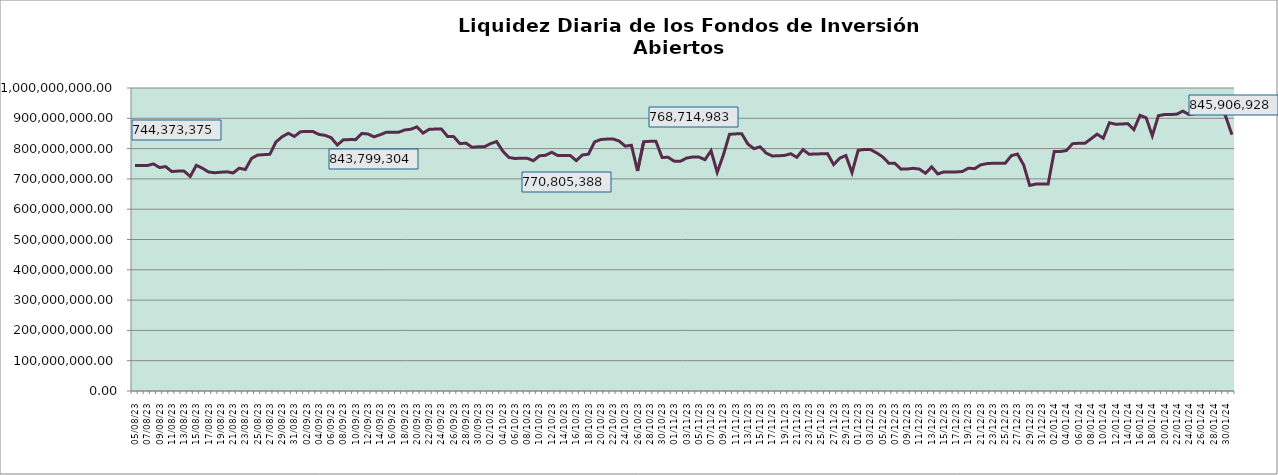
| Category | Series 0 |
|---|---|
| 2023-08-05 | 744373375.25 |
| 2023-08-06 | 744244089.34 |
| 2023-08-07 | 744156721.15 |
| 2023-08-08 | 749436294.31 |
| 2023-08-09 | 737541120.52 |
| 2023-08-10 | 740581950.01 |
| 2023-08-11 | 724080601.72 |
| 2023-08-12 | 725788397.34 |
| 2023-08-13 | 725649372.75 |
| 2023-08-14 | 708067960.8 |
| 2023-08-15 | 744803219.59 |
| 2023-08-16 | 735083408.49 |
| 2023-08-17 | 722859996.71 |
| 2023-08-18 | 720251296.81 |
| 2023-08-19 | 722066163.03 |
| 2023-08-20 | 723480147.63 |
| 2023-08-21 | 719544022.09 |
| 2023-08-22 | 735338465.03 |
| 2023-08-23 | 730883380.15 |
| 2023-08-24 | 767500076.65 |
| 2023-08-25 | 778542441.96 |
| 2023-08-26 | 779996982.01 |
| 2023-08-27 | 781275232.08 |
| 2023-08-28 | 821975308.4 |
| 2023-08-29 | 839149402.66 |
| 2023-08-30 | 850388672.3 |
| 2023-08-31 | 840083050.96 |
| 2023-09-01 | 855717371.21 |
| 2023-09-02 | 856447592.74 |
| 2023-09-03 | 856518443.03 |
| 2023-09-04 | 846800888.01 |
| 2023-09-05 | 843799303.73 |
| 2023-09-06 | 836064243.98 |
| 2023-09-07 | 811835895.2 |
| 2023-09-08 | 829200588.03 |
| 2023-09-09 | 829710703.66 |
| 2023-09-10 | 829589151.05 |
| 2023-09-11 | 849892786.18 |
| 2023-09-12 | 848258732.7 |
| 2023-09-13 | 838817623.5 |
| 2023-09-14 | 845684000.27 |
| 2023-09-15 | 853912064.49 |
| 2023-09-16 | 854003181.36 |
| 2023-09-17 | 853882893.87 |
| 2023-09-18 | 861587443.4 |
| 2023-09-19 | 863825271.92 |
| 2023-09-20 | 871739708.28 |
| 2023-09-21 | 851274397.87 |
| 2023-09-22 | 863690740.26 |
| 2023-09-23 | 864423462.74 |
| 2023-09-24 | 864495939.38 |
| 2023-09-25 | 840094915.65 |
| 2023-09-26 | 839493871.47 |
| 2023-09-27 | 816397016.16 |
| 2023-09-28 | 818057445.14 |
| 2023-09-29 | 804357452.04 |
| 2023-09-30 | 805987241.89 |
| 2023-10-01 | 805861177.96 |
| 2023-10-02 | 816400848.97 |
| 2023-10-03 | 823292924.62 |
| 2023-10-04 | 791885328.33 |
| 2023-10-05 | 770805388.24 |
| 2023-10-06 | 767335904.7 |
| 2023-10-07 | 768415448.37 |
| 2023-10-08 | 768284658.47 |
| 2023-10-09 | 759931172.94 |
| 2023-10-10 | 776307966.06 |
| 2023-10-11 | 777978215.8 |
| 2023-10-12 | 787829367.49 |
| 2023-10-13 | 776843829.35 |
| 2023-10-14 | 776920366.75 |
| 2023-10-15 | 777520156.16 |
| 2023-10-16 | 760311511.08 |
| 2023-10-17 | 778972902.37 |
| 2023-10-18 | 781669931.69 |
| 2023-10-19 | 822356076.87 |
| 2023-10-20 | 829958566.75 |
| 2023-10-21 | 831436078.01 |
| 2023-10-22 | 831858452.66 |
| 2023-10-23 | 824908511.09 |
| 2023-10-24 | 808109378.63 |
| 2023-10-25 | 810985013.22 |
| 2023-10-26 | 726083306.33 |
| 2023-10-27 | 822647422.52 |
| 2023-10-28 | 824001909.86 |
| 2023-10-29 | 823876506.61 |
| 2023-10-30 | 770919488.28 |
| 2023-10-31 | 771130577.98 |
| 2023-11-01 | 758264332.87 |
| 2023-11-02 | 758373803.82 |
| 2023-11-03 | 768714983.43 |
| 2023-11-04 | 772179484.49 |
| 2023-11-05 | 772323569.13 |
| 2023-11-06 | 763367951.57 |
| 2023-11-07 | 792983502.5 |
| 2023-11-08 | 721638313.77 |
| 2023-11-09 | 778664606.79 |
| 2023-11-10 | 847133613.42 |
| 2023-11-11 | 848551214.1 |
| 2023-11-12 | 849139213.45 |
| 2023-11-13 | 815078203.41 |
| 2023-11-14 | 799630243.1 |
| 2023-11-15 | 805792345.1 |
| 2023-11-16 | 785029389.34 |
| 2023-11-17 | 775716450.94 |
| 2023-11-18 | 776309591.81 |
| 2023-11-19 | 777555671.55 |
| 2023-11-20 | 783102557.43 |
| 2023-11-21 | 771135511.34 |
| 2023-11-22 | 796718313.71 |
| 2023-11-23 | 781344537.67 |
| 2023-11-24 | 782266750.8 |
| 2023-11-25 | 782726600.14 |
| 2023-11-26 | 783455376.83 |
| 2023-11-27 | 747065225.8 |
| 2023-11-28 | 768489871.93 |
| 2023-11-29 | 777269842.82 |
| 2023-11-30 | 720652886.48 |
| 2023-12-01 | 794413077.37 |
| 2023-12-02 | 796941939.55 |
| 2023-12-03 | 797061690.61 |
| 2023-12-04 | 786052940.1 |
| 2023-12-05 | 772705894.99 |
| 2023-12-06 | 751866529.5 |
| 2023-12-07 | 751273612.08 |
| 2023-12-08 | 732200587.07 |
| 2023-12-09 | 732618765.02 |
| 2023-12-10 | 734977990.92 |
| 2023-12-11 | 732335473.7 |
| 2023-12-12 | 718631426.81 |
| 2023-12-13 | 739636751.02 |
| 2023-12-14 | 716352995.32 |
| 2023-12-15 | 723057477.07 |
| 2023-12-16 | 722889458.85 |
| 2023-12-17 | 722984908.96 |
| 2023-12-18 | 724345793.57 |
| 2023-12-19 | 735446579.01 |
| 2023-12-20 | 733743517.41 |
| 2023-12-21 | 746283219.33 |
| 2023-12-22 | 750445223.45 |
| 2023-12-23 | 751642183.57 |
| 2023-12-24 | 751513402.91 |
| 2023-12-25 | 751628523.3 |
| 2023-12-26 | 776674715.25 |
| 2023-12-27 | 781963225.03 |
| 2023-12-28 | 746551489.31 |
| 2023-12-29 | 678387935.77 |
| 2023-12-30 | 682929910.02 |
| 2023-12-31 | 682916992.01 |
| 2024-01-01 | 682779412.04 |
| 2024-01-02 | 790505203.1 |
| 2024-01-03 | 790146282.02 |
| 2024-01-04 | 793823002.4 |
| 2024-01-05 | 816293106.46 |
| 2024-01-06 | 817545565.7 |
| 2024-01-07 | 817410815.2 |
| 2024-01-08 | 832303234.16 |
| 2024-01-09 | 847828584.52 |
| 2024-01-10 | 834235111.24 |
| 2024-01-11 | 885197757.4 |
| 2024-01-12 | 880436363.23 |
| 2024-01-13 | 881088674.97 |
| 2024-01-14 | 882419770.78 |
| 2024-01-15 | 862608396.76 |
| 2024-01-16 | 909800403.34 |
| 2024-01-17 | 901660841.54 |
| 2024-01-18 | 842412437.33 |
| 2024-01-19 | 908681686.2 |
| 2024-01-20 | 912552752.95 |
| 2024-01-21 | 912413805.05 |
| 2024-01-22 | 913716175.24 |
| 2024-01-23 | 923615500.08 |
| 2024-01-24 | 912143416.06 |
| 2024-01-25 | 915328383.79 |
| 2024-01-26 | 922852474 |
| 2024-01-27 | 924296547.31 |
| 2024-01-28 | 924158784.48 |
| 2024-01-29 | 944947536.03 |
| 2024-01-30 | 905003413.81 |
| 2024-01-31 | 845906928.35 |